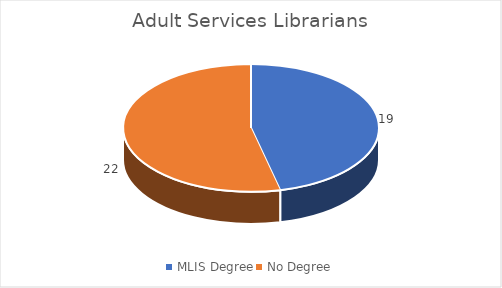
| Category | Series 0 |
|---|---|
| MLIS Degree | 19 |
| No Degree | 22 |